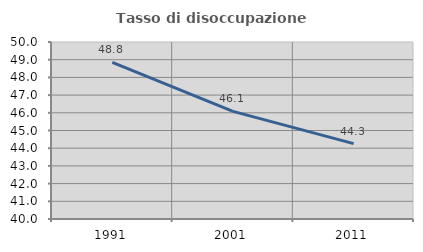
| Category | Tasso di disoccupazione giovanile  |
|---|---|
| 1991.0 | 48.846 |
| 2001.0 | 46.082 |
| 2011.0 | 44.256 |